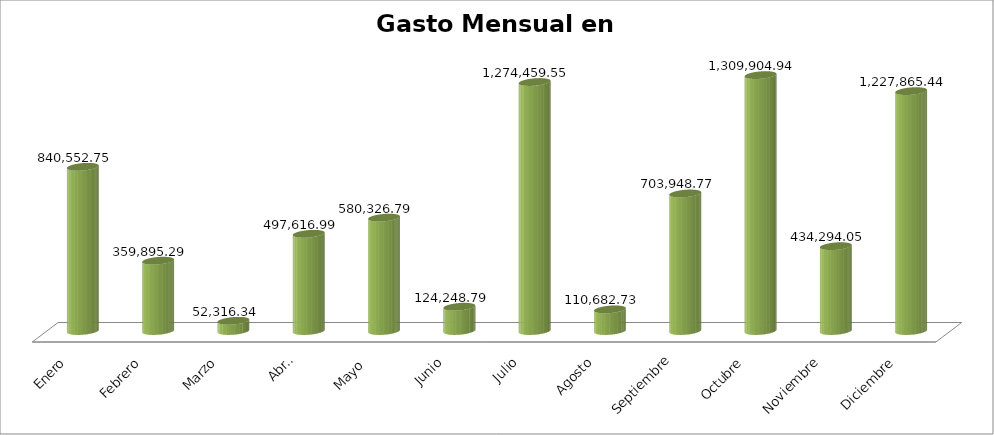
| Category | Suma |
|---|---|
| Enero | 840552.75 |
| Febrero | 359895.29 |
| Marzo | 52316.34 |
| Abril | 497616.99 |
| Mayo  | 580326.79 |
| Junio | 124248.79 |
| Julio | 1274459.55 |
| Agosto | 110682.73 |
| Septiembre | 703948.77 |
| Octubre | 1309904.94 |
| Noviembre | 434294.05 |
| Diciembre | 1227865.44 |